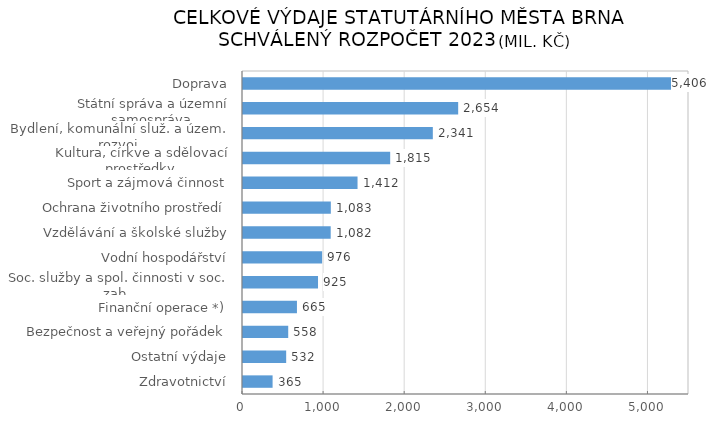
| Category | Series 0 |
|---|---|
|  Zdravotnictví | 364.891 |
|  Ostatní výdaje | 532.395 |
|  Bezpečnost a veřejný pořádek | 557.659 |
|  Finanční operace *) | 665.252 |
|  Soc. služby a spol. činnosti v soc. zab. | 925.127 |
|  Vodní hospodářství | 975.767 |
|  Vzdělávání a školské služby | 1081.574 |
|  Ochrana životního prostředí | 1083.052 |
|  Sport a zájmová činnost | 1412.441 |
|  Kultura, církve a sdělovací prostředky | 1815.094 |
|  Bydlení, komunální služ. a územ. rozvoj | 2340.899 |
|  Státní správa a územní samospráva | 2653.604 |
|  Doprava | 5406.283 |